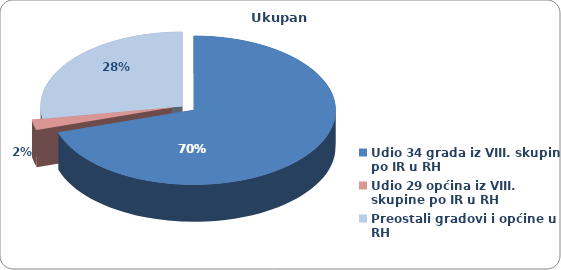
| Category | Ukupan prihod |
|---|---|
| Udio 34 grada iz VIII. skupine po IR u RH | 0.701 |
| Udio 29 općina iz VIII. skupine po IR u RH | 0.022 |
| Preostali gradovi i općine u RH | 0.277 |